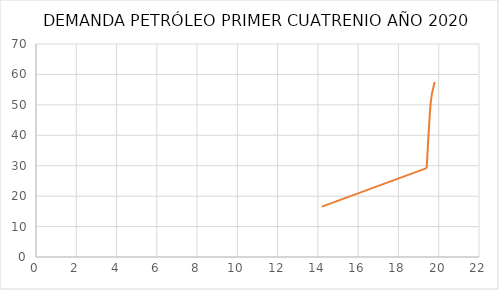
| Category | USD $ POR BARRIL |
|---|---|
| 19.8 | 57.52 |
| 19.6 | 50.54 |
| 19.4 | 29.21 |
| 14.2 | 16.55 |